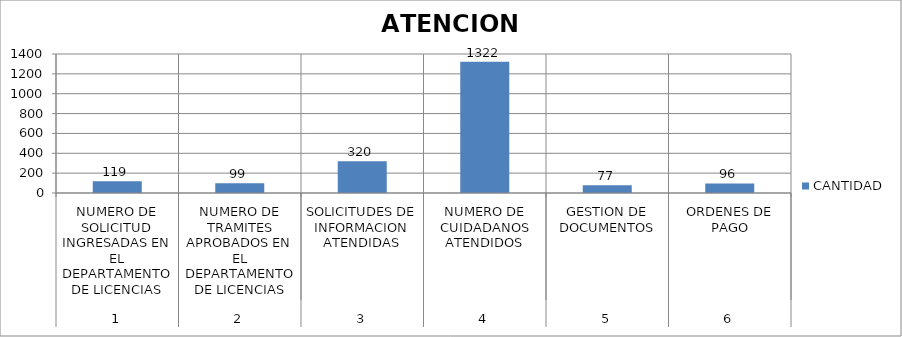
| Category | CANTIDAD |
|---|---|
| 0 | 119 |
| 1 | 99 |
| 2 | 320 |
| 3 | 1322 |
| 4 | 77 |
| 5 | 96 |